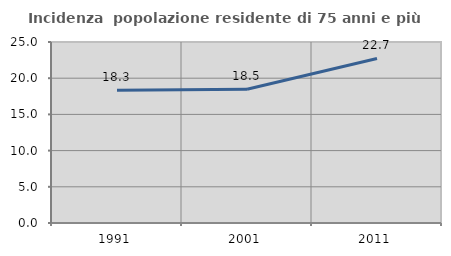
| Category | Incidenza  popolazione residente di 75 anni e più |
|---|---|
| 1991.0 | 18.349 |
| 2001.0 | 18.471 |
| 2011.0 | 22.727 |